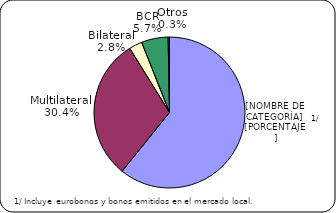
| Category | Series 0 |
|---|---|
| Inversionistas | 7483.7 |
| Multilateral | 3737 |
| Bilateral | 345.6 |
| BCR | 704.3 |
| Otros | 35.7 |